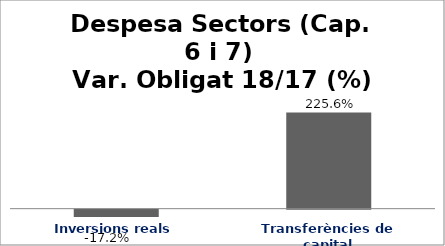
| Category | Series 0 |
|---|---|
| Inversions reals | -0.172 |
| Transferències de capital | 2.256 |